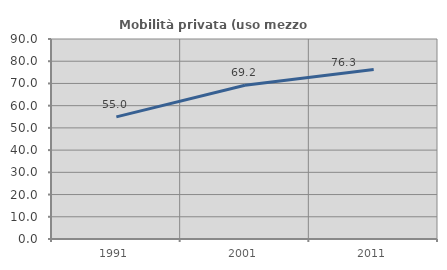
| Category | Mobilità privata (uso mezzo privato) |
|---|---|
| 1991.0 | 54.967 |
| 2001.0 | 69.17 |
| 2011.0 | 76.295 |